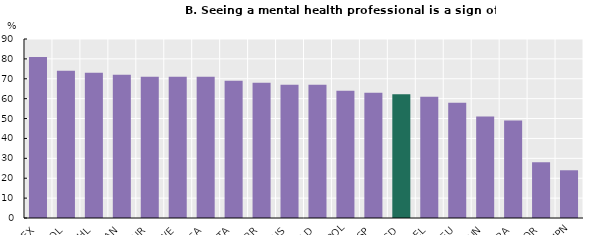
| Category | Seeing a mental health professional is a sign of strength |
|---|---|
| MEX | 81 |
| COL | 74 |
| CHL | 73 |
| CAN | 72 |
| TUR | 71 |
| SWE | 71 |
| USA | 71 |
| ITA | 69 |
| GBR | 68 |
| AUS | 67 |
| NLD | 67 |
| POL | 64 |
| ESP | 63 |
| OECD | 62.211 |
| BEL | 61 |
| DEU | 58 |
| HUN | 51 |
| FRA | 49 |
| KOR | 28 |
| JPN | 24 |